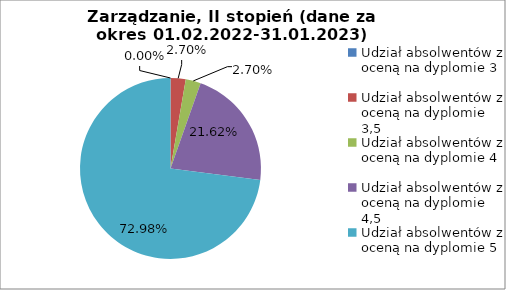
| Category | Series 0 |
|---|---|
| Udział absolwentów z oceną na dyplomie 3 | 0 |
| Udział absolwentów z oceną na dyplomie 3,5 | 2.703 |
| Udział absolwentów z oceną na dyplomie 4 | 2.703 |
| Udział absolwentów z oceną na dyplomie 4,5 | 21.622 |
| Udział absolwentów z oceną na dyplomie 5 | 72.973 |